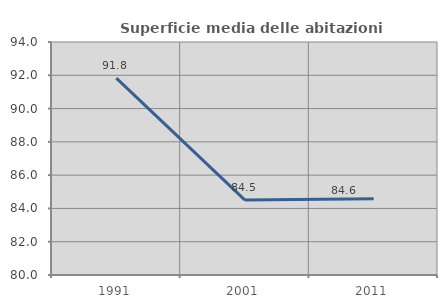
| Category | Superficie media delle abitazioni occupate |
|---|---|
| 1991.0 | 91.828 |
| 2001.0 | 84.502 |
| 2011.0 | 84.578 |